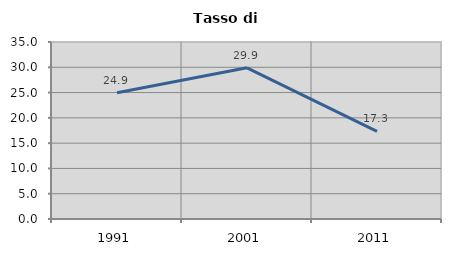
| Category | Tasso di disoccupazione   |
|---|---|
| 1991.0 | 24.949 |
| 2001.0 | 29.899 |
| 2011.0 | 17.325 |